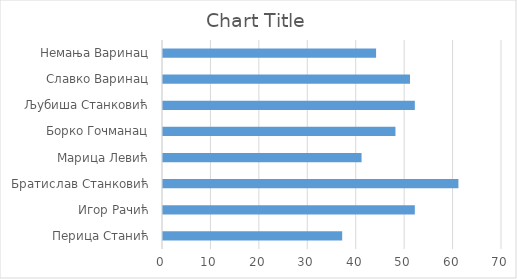
| Category | Series 0 |
|---|---|
| Перица Станић | 37 |
| Игор Рачић | 52 |
| Братислав Станковић | 61 |
| Марица Левић | 41 |
| Борко Гочманац | 48 |
| Љубиша Станковић | 52 |
| Славко Варинац | 51 |
| Немања Варинац | 44 |